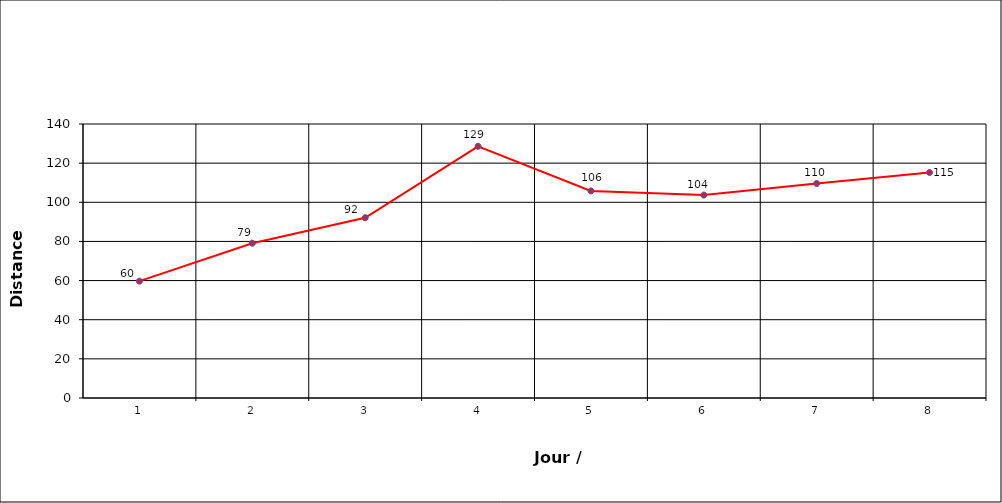
| Category | Series 1 |
|---|---|
| 1.0 | 59.7 |
| 2.0 | 79.1 |
| 3.0 | 92.1 |
| 4.0 | 128.6 |
| 5.0 | 105.8 |
| 6.0 | 103.7 |
| 7.0 | 109.6 |
| 8.0 | 115.2 |